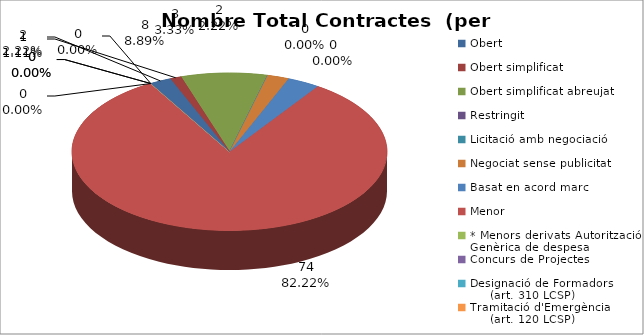
| Category | Nombre Total Contractes |
|---|---|
| Obert | 2 |
| Obert simplificat | 1 |
| Obert simplificat abreujat | 8 |
| Restringit | 0 |
| Licitació amb negociació | 0 |
| Negociat sense publicitat | 2 |
| Basat en acord marc | 3 |
| Menor | 74 |
| * Menors derivats Autorització Genèrica de despesa | 0 |
| Concurs de Projectes | 0 |
| Designació de Formadors
     (art. 310 LCSP) | 0 |
| Tramitació d'Emergència
     (art. 120 LCSP) | 0 |